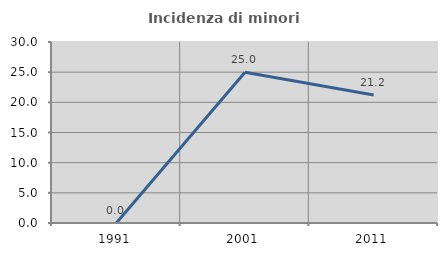
| Category | Incidenza di minori stranieri |
|---|---|
| 1991.0 | 0 |
| 2001.0 | 25 |
| 2011.0 | 21.212 |